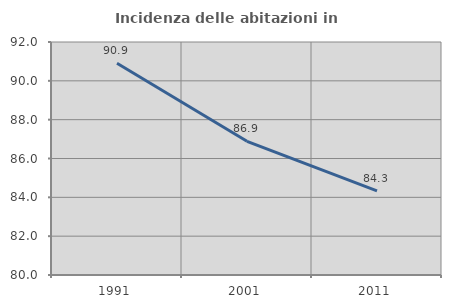
| Category | Incidenza delle abitazioni in proprietà  |
|---|---|
| 1991.0 | 90.909 |
| 2001.0 | 86.885 |
| 2011.0 | 84.333 |